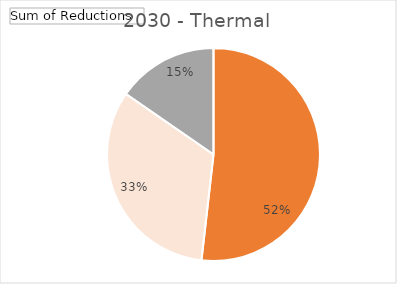
| Category | 2030 |
|---|---|
| 0 | 0.518 |
| 1 | 0.328 |
| 2 | 0.154 |